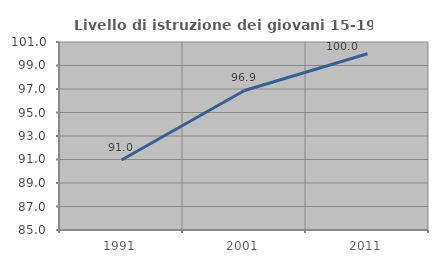
| Category | Livello di istruzione dei giovani 15-19 anni |
|---|---|
| 1991.0 | 90.96 |
| 2001.0 | 96.875 |
| 2011.0 | 100 |